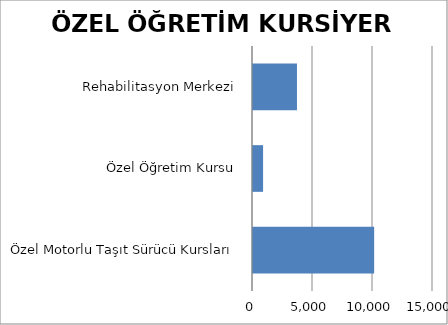
| Category | ÖZEL YAYGIN EĞİTİM KURSİYER SAYISI |
|---|---|
| Özel Motorlu Taşıt Sürücü Kursları | 10097 |
| Özel Öğretim Kursu | 840 |
| Rehabilitasyon Merkezi | 3665 |